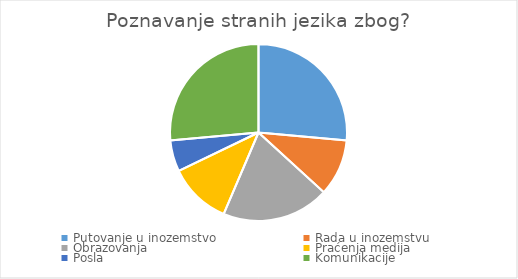
| Category | POSTOTAK 61% 13% 16% 43% 6% 3% 3% POSTOTAK 19% 52% 26% 10% POSTOTAK |
|---|---|
| Putovanje u inozemstvo  | 0.74 |
| Rada u inozemstvu | 0.29 |
| Obrazovanja | 0.55 |
| Praćenja medija | 0.32 |
| Posla | 0.16 |
| Komunikacije | 0.74 |